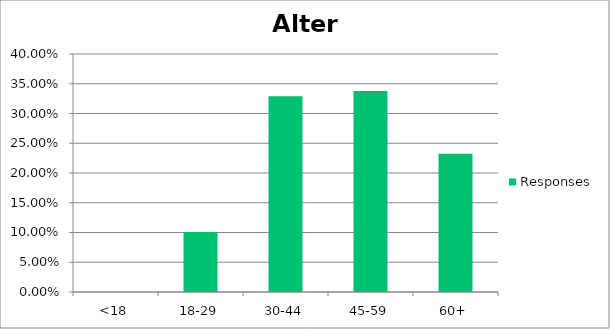
| Category | Responses |
|---|---|
| <18 | 0 |
| 18-29 | 0.101 |
| 30-44 | 0.329 |
| 45-59 | 0.338 |
| 60+ | 0.232 |